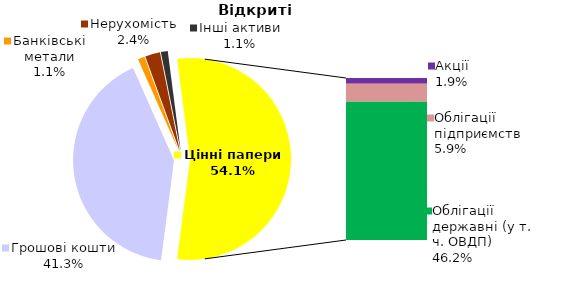
| Category | Відкриті |
|---|---|
| Грошові кошти | 364.534 |
| Банківські метали | 9.746 |
| Нерухомість | 21.155 |
| Інші активи | 9.76 |
| Акції | 17.164 |
| Облігації підприємств | 52.524 |
| Муніципальні облігації | 0 |
| Облігації державні (у т. ч. ОВДП) | 407.884 |